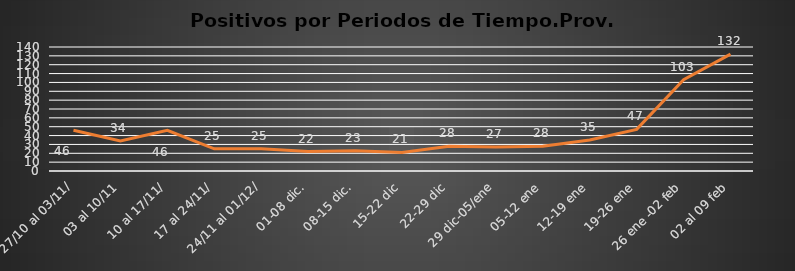
| Category | Prov. Caraveli |
|---|---|
| 27/10 al 03/11/ | 46 |
| 03 al 10/11 | 34 |
| 10 al 17/11/ | 46 |
|  17 al 24/11/ | 25 |
|  24/11 al 01/12/ | 25 |
| 01-08 dic. | 22 |
| 08-15 dic. | 23 |
| 15-22 dic | 21 |
| 22-29 dic | 28 |
| 29 dic-05/ene | 27 |
| 05-12 ene | 28 |
| 12-19 ene | 35 |
| 19-26 ene | 47 |
| 26 ene -02 feb | 103 |
| 02 al 09 feb | 132 |